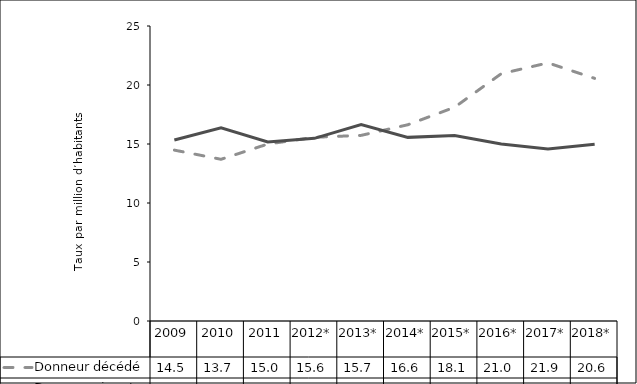
| Category | Donneur décédé  | Donneur vivant  |
|---|---|---|
| 2009 | 14.482 | 15.344 |
| 2010 | 13.704 | 16.38 |
| 2011 | 14.996 | 15.171 |
| 2012* | 15.568 | 15.482 |
| 2013* | 15.732 | 16.642 |
| 2014* | 16.631 | 15.562 |
| 2015* | 18.112 | 15.712 |
| 2016* | 20.957 | 15.001 |
| 2017* | 21.875 | 14.574 |
| 2018* | 20.562 | 14.976 |